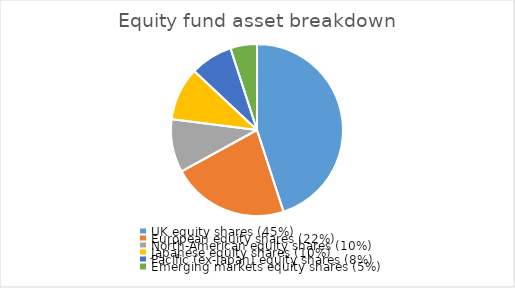
| Category | UK equity shares (45%) |
|---|---|
| UK equity shares (45%) | 45 |
| European equity shares (22%) | 22 |
| North-American equity shares (10%) | 10 |
| Japanese equity shares (10%) | 10 |
| Pacific (ex-Japan) equity shares (8%) | 8 |
| Emerging markets equity shares (5%) | 5 |